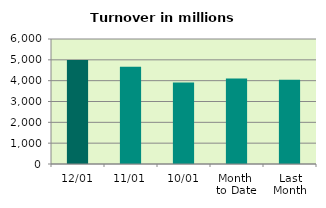
| Category | Series 0 |
|---|---|
| 12/01 | 4994.414 |
| 11/01 | 4669.521 |
| 10/01 | 3914.395 |
| Month 
to Date | 4101.475 |
| Last
Month | 4039.067 |